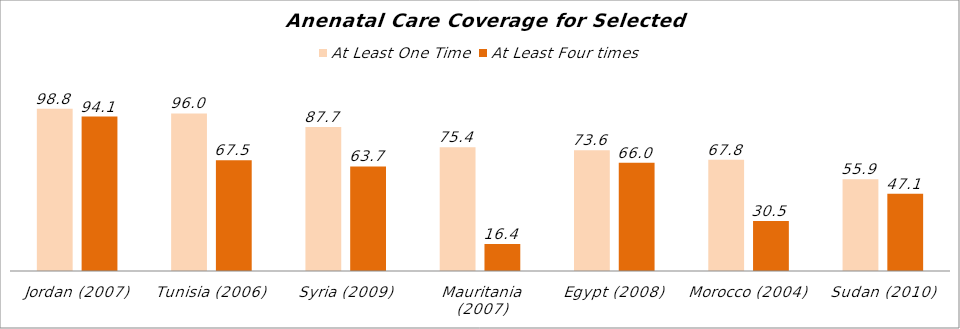
| Category | At Least One Time | At Least Four times |
|---|---|---|
| Jordan (2007) | 98.8 | 94.1 |
| Tunisia (2006) | 96 | 67.5 |
| Syria (2009) | 87.7 | 63.7 |
| Mauritania (2007) | 75.4 | 16.4 |
| Egypt (2008) | 73.6 | 66 |
| Morocco (2004) | 67.8 | 30.5 |
| Sudan (2010) | 55.9 | 47.1 |